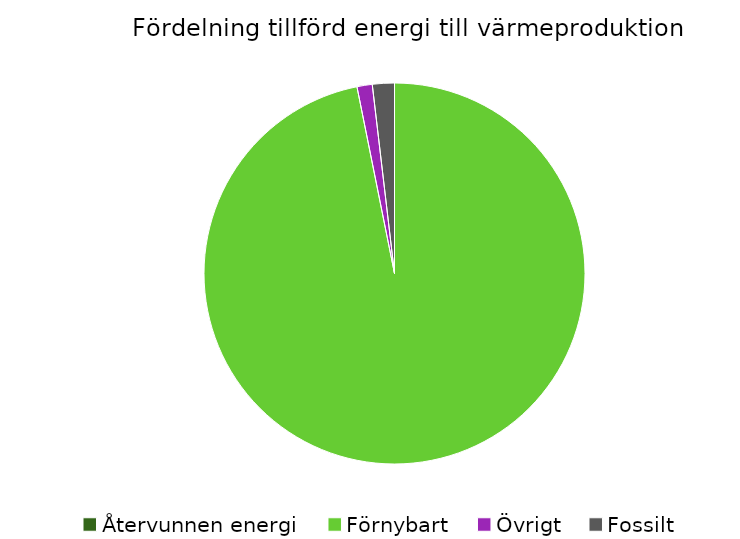
| Category | Fördelning värmeproduktion |
|---|---|
| Återvunnen energi | 0 |
| Förnybart | 0.968 |
| Övrigt | 0.013 |
| Fossilt | 0.019 |